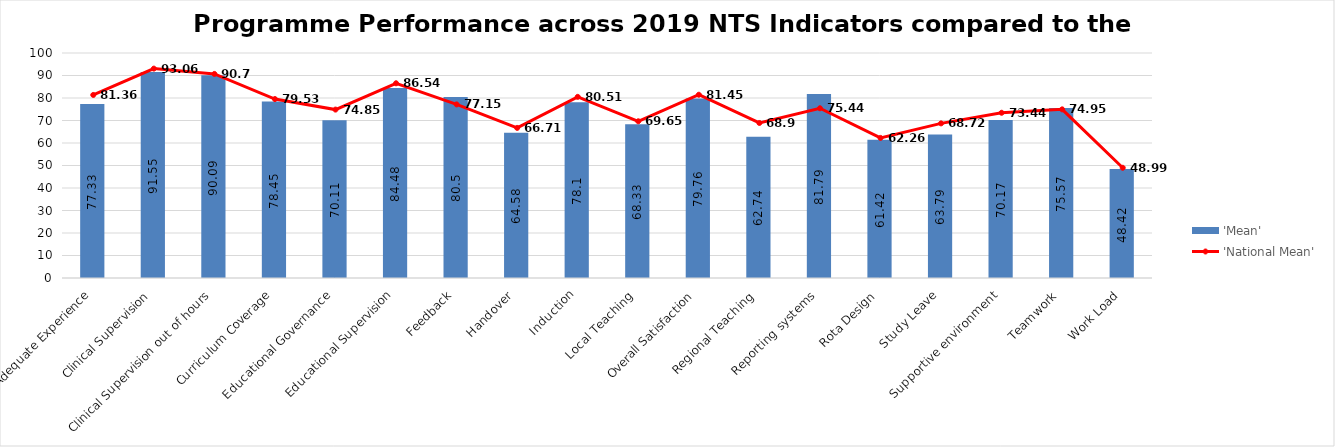
| Category | 'Mean' |
|---|---|
| Adequate Experience | 77.33 |
| Clinical Supervision | 91.55 |
| Clinical Supervision out of hours | 90.09 |
| Curriculum Coverage | 78.45 |
| Educational Governance | 70.11 |
| Educational Supervision | 84.48 |
| Feedback | 80.5 |
| Handover | 64.58 |
| Induction | 78.1 |
| Local Teaching | 68.33 |
| Overall Satisfaction | 79.76 |
| Regional Teaching | 62.74 |
| Reporting systems | 81.79 |
| Rota Design | 61.42 |
| Study Leave | 63.79 |
| Supportive environment | 70.17 |
| Teamwork | 75.57 |
| Work Load | 48.42 |